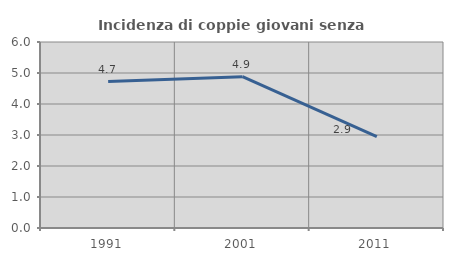
| Category | Incidenza di coppie giovani senza figli |
|---|---|
| 1991.0 | 4.722 |
| 2001.0 | 4.883 |
| 2011.0 | 2.949 |